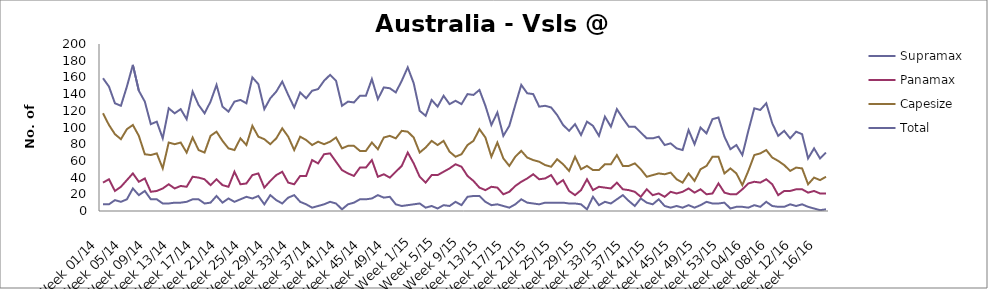
| Category | Supramax | Panamax | Capesize | Total |
|---|---|---|---|---|
| Week 01/14 | 8 | 34 | 117 | 159 |
| Week 02/14 | 8 | 38 | 103 | 149 |
| Week 03/14 | 13 | 24 | 92 | 129 |
| Week 04/14 | 11 | 29 | 86 | 126 |
| Week 05/14 | 14 | 37 | 98 | 149 |
| Week 06/14 | 27 | 45 | 103 | 175 |
| Week 07/14 | 19 | 35 | 90 | 144 |
| Week 08/14 | 24 | 39 | 68 | 131 |
| Week 09/14 | 14 | 23 | 67 | 104 |
| Week 10/14 | 14 | 24 | 69 | 107 |
| Week 11/14 | 9 | 27 | 51 | 87 |
| Week 12/14 | 9 | 32 | 82 | 123 |
| Week 13/14 | 10 | 27 | 80 | 117 |
| Week 14/14 | 10 | 30 | 82 | 122 |
| Week 15/14 | 11 | 29 | 70 | 110 |
| Week 16/14 | 14 | 41 | 88 | 143 |
| Week 17/14 | 14 | 40 | 73 | 127 |
| Week 18/14 | 9 | 38 | 70 | 117 |
| Week 19/14 | 10 | 31 | 90 | 131 |
| Week 20/14 | 18 | 38 | 95 | 151 |
| Week 21/14 | 10 | 31 | 84 | 125 |
| Week 22/14 | 15 | 29 | 75 | 119 |
| Week 23/14 | 11 | 47 | 73 | 131 |
| Week 24/14 | 14 | 32 | 87 | 133 |
| Week 25/14 | 17 | 33 | 79 | 129 |
| Week 26/14 | 15 | 43 | 102 | 160 |
| Week 27/14 | 18 | 45 | 89 | 152 |
| Week 28/14 | 8 | 28 | 86 | 122 |
| Week 29/14 | 19 | 36 | 80 | 135 |
| Week 30/14 | 13 | 43 | 87 | 143 |
| Week 31/14 | 9 | 47 | 99 | 155 |
| Week 32/14 | 16 | 34 | 89 | 139 |
| Week 33/14 | 19 | 32 | 73 | 124 |
| Week 34/14 | 11 | 42 | 89 | 142 |
| Week 35/14 | 8 | 42 | 85 | 135 |
| Week 36/14 | 4 | 61 | 79 | 144 |
| Week 37/14 | 6 | 57 | 83 | 146 |
| Week 38/14 | 8 | 68 | 80 | 156 |
| Week 39/14 | 11 | 69 | 83 | 163 |
| Week 40/14 | 9 | 59 | 88 | 156 |
| Week 41/14 | 2 | 49 | 75 | 126 |
| Week 42/14 | 8 | 45 | 78 | 131 |
| Week 43/14 | 10 | 42 | 78 | 130 |
| Week 44/14 | 14 | 52 | 72 | 138 |
| Week 45/14 | 14 | 52 | 72 | 138 |
| Week 46/14 | 15 | 61 | 82 | 158 |
| Week 47/14 | 19 | 41 | 74 | 134 |
| Week 48/14 | 16 | 44 | 88 | 148 |
| Week 49/14 | 17 | 40 | 90 | 147 |
| Week 50/14 | 8 | 47 | 87 | 142 |
| Week 51/14 | 6 | 54 | 96 | 156 |
| Week 52/14 | 7 | 70 | 95 | 172 |
| Week 1/15 | 8 | 57 | 88 | 153 |
| Week 2/15 | 9 | 41 | 70 | 120 |
| Week 3/15 | 4 | 34 | 76 | 114 |
| Week 4/15 | 6 | 43 | 84 | 133 |
| Week 5/15 | 3 | 43 | 79 | 125 |
| Week 6/15 | 7 | 47 | 84 | 138 |
| Week 7/15 | 6 | 51 | 71 | 128 |
| Week 8/15 | 11 | 56 | 65 | 132 |
| Week 9/15 | 7 | 53 | 68 | 128 |
| Week 10/15 | 17 | 42 | 79 | 140 |
| Week 11/15 | 18 | 36 | 84 | 139 |
| Week 12/15 | 18 | 28 | 98 | 145 |
| Week 13/15 | 11 | 25 | 88 | 126 |
| Week 14/15 | 7 | 29 | 65 | 103 |
| Week 15/15 | 8 | 28 | 82 | 118 |
| Week 16/15 | 6 | 20 | 63 | 90 |
| Week 17/15 | 4 | 23 | 54 | 102 |
| Week 18/15 | 8 | 30 | 65 | 127 |
| Week 19/15 | 14 | 35 | 72 | 151 |
| Week 20/15 | 10 | 39 | 64 | 141 |
| Week 21/15 | 9 | 44 | 61 | 140 |
| Week 22/15 | 8 | 38 | 59 | 125 |
| Week 23/15 | 10 | 39 | 55 | 126 |
| Week 24/15 | 10 | 43 | 53 | 124 |
| Week 25/15 | 10 | 32 | 62 | 115 |
| Week 26/15 | 10 | 37 | 56 | 103 |
| Week 27/15 | 9 | 24 | 48 | 96 |
| Week 28/15 | 9 | 19 | 65 | 104 |
| Week 29/15 | 8 | 25 | 50 | 91 |
| Week 30/15 | 2 | 38 | 54 | 107 |
| Week 31/15 | 17 | 25 | 49 | 102 |
| Week 32/15 | 7 | 29 | 49 | 90 |
| Week 33/15 | 11 | 28 | 56 | 113 |
| Week 34/15 | 9 | 27 | 56 | 101 |
| Week 35/15 | 14 | 34 | 67 | 122 |
| Week 36/15 | 19 | 26 | 54 | 111 |
| Week 37/15 | 12 | 25 | 54 | 101 |
| Week 38/15 | 6 | 23 | 57 | 101 |
| Week 39/15 | 15 | 17 | 50 | 94 |
| Week 40/15 | 10 | 26 | 41 | 87 |
| Week 41/15 | 8 | 19 | 43 | 87 |
| Week 42/15 | 14 | 21 | 45 | 89 |
| Week 43/15 | 6 | 17 | 44 | 79 |
| Week 44/15 | 4 | 23 | 46 | 81 |
| Week 45/15 | 6 | 21 | 38 | 75 |
| Week 46/15 | 4 | 23 | 34 | 73 |
| Week 47/15 | 7 | 27 | 45 | 97 |
| Week 48/15 | 4 | 22 | 36 | 80 |
| Week 49/15 | 7 | 26 | 50 | 100 |
| Week 50/15 | 11 | 20 | 54 | 93 |
| Week 51/15 | 9 | 21 | 65 | 110 |
| Week 52/15 | 9 | 33 | 65 | 112 |
| Week 53/15 | 10 | 22 | 45 | 89 |
| Week 01/16 | 3 | 20 | 51 | 74 |
| Week 02/16 | 5 | 20 | 45 | 79 |
| Week 03/16 | 5 | 26 | 31 | 67 |
| Week 04/16 | 4 | 33 | 48 | 96 |
| Week 05/16 | 7 | 35 | 67 | 123 |
| Week 06/16 | 5 | 34 | 69 | 121 |
| Week 07/16 | 11 | 38 | 73 | 129 |
| Week 08/16 | 6 | 32 | 64 | 105 |
| Week 09/16 | 5 | 19 | 60 | 90 |
| Week 10/16 | 5 | 24 | 55 | 96 |
| Week 11/16 | 8 | 24 | 48 | 87 |
| Week 12/16 | 6 | 26 | 52 | 95 |
| Week 13/16 | 8 | 26 | 51 | 92 |
| Week 14/16 | 5 | 22 | 32 | 63 |
| Week 15/16 | 3 | 24 | 40 | 75 |
| Week 16/16 | 1 | 21 | 37 | 63 |
| Week 17/16 | 2 | 21 | 41 | 70 |